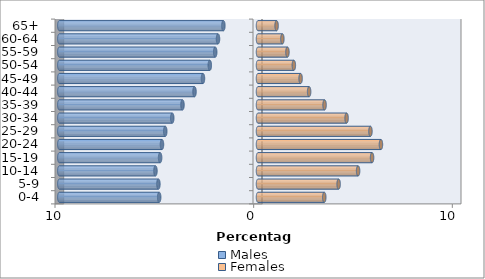
| Category | Males | Females |
|---|---|---|
| 0-4 | -4.974 | 3.336 |
| 5-9 | -5.013 | 4.059 |
| 10-14 | -5.162 | 5.039 |
| 15-19 | -4.927 | 5.742 |
| 20-24 | -4.834 | 6.188 |
| 25-29 | -4.669 | 5.66 |
| 30-34 | -4.317 | 4.46 |
| 35-39 | -3.802 | 3.351 |
| 40-44 | -3.196 | 2.573 |
| 45-49 | -2.77 | 2.144 |
| 50-54 | -2.426 | 1.804 |
| 55-59 | -2.154 | 1.482 |
| 60-64 | -2.014 | 1.227 |
| 65+ | -1.743 | 0.936 |